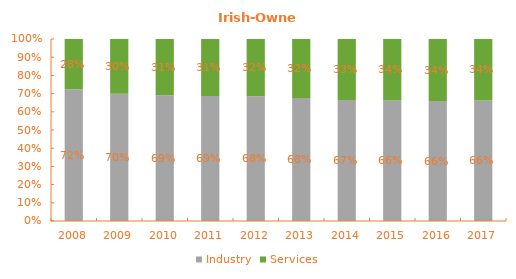
| Category | Industry | Services |
|---|---|---|
| 2008.0 | 0.723 | 0.277 |
| 2009.0 | 0.699 | 0.301 |
| 2010.0 | 0.691 | 0.309 |
| 2011.0 | 0.687 | 0.313 |
| 2012.0 | 0.685 | 0.315 |
| 2013.0 | 0.675 | 0.325 |
| 2014.0 | 0.665 | 0.335 |
| 2015.0 | 0.662 | 0.338 |
| 2016.0 | 0.659 | 0.341 |
| 2017.0 | 0.662 | 0.338 |